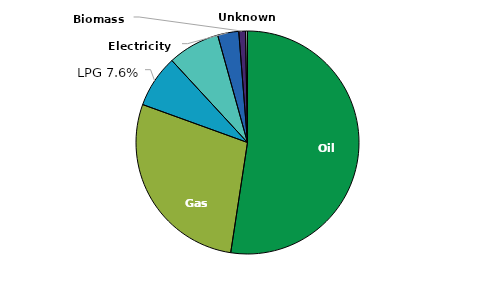
| Category | Series 0 | Series 1 |
|---|---|---|
| Oil | 30509 | 0.277 |
| Gas | 16369 | 0.148 |
| LPG | 4434 | 0.04 |
| Coal | 4390 | 0.04 |
| Electricity | 1782 | 0.016 |
| Biomass | 567 | 0.005 |
| Unknown | 164 | 0.001 |